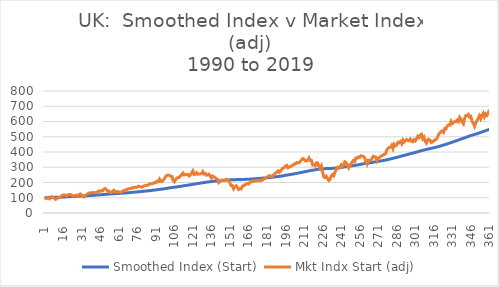
| Category | Smoothed Index (Start) | Mkt Indx Start (adj) |
|---|---|---|
| 1.0 | 100 | 100 |
| 2.0 | 100.297 | 97.055 |
| 3.0 | 100.58 | 95.78 |
| 4.0 | 100.884 | 98.164 |
| 5.0 | 101.138 | 93.34 |
| 6.0 | 101.524 | 106.637 |
| 7.0 | 101.912 | 107.137 |
| 8.0 | 102.267 | 104.192 |
| 9.0 | 102.533 | 95.473 |
| 10.0 | 102.735 | 89.209 |
| 11.0 | 102.991 | 94.771 |
| 12.0 | 103.301 | 100.327 |
| 13.0 | 103.619 | 101.316 |
| 14.0 | 103.944 | 102.266 |
| 15.0 | 104.385 | 114.104 |
| 16.0 | 104.858 | 117.647 |
| 17.0 | 105.333 | 118.018 |
| 18.0 | 105.793 | 116.926 |
| 19.0 | 106.203 | 112.277 |
| 20.0 | 106.685 | 119.671 |
| 21.0 | 107.186 | 121.955 |
| 22.0 | 107.675 | 121.093 |
| 23.0 | 108.126 | 117.558 |
| 24.0 | 108.504 | 110.575 |
| 25.0 | 108.899 | 112.63 |
| 26.0 | 109.331 | 116.484 |
| 27.0 | 109.761 | 116.563 |
| 28.0 | 110.134 | 111.262 |
| 29.0 | 110.618 | 122.5 |
| 30.0 | 111.12 | 124.711 |
| 31.0 | 111.527 | 115.494 |
| 32.0 | 111.863 | 108.753 |
| 33.0 | 112.16 | 104.99 |
| 34.0 | 112.57 | 116.471 |
| 35.0 | 113.026 | 121.468 |
| 36.0 | 113.534 | 126.877 |
| 37.0 | 114.084 | 131.413 |
| 38.0 | 114.624 | 130.829 |
| 39.0 | 115.185 | 133.259 |
| 40.0 | 115.757 | 134.761 |
| 41.0 | 116.302 | 132.468 |
| 42.0 | 116.855 | 133.616 |
| 43.0 | 117.428 | 135.931 |
| 44.0 | 118.007 | 137.035 |
| 45.0 | 118.664 | 145.15 |
| 46.0 | 119.284 | 141.879 |
| 47.0 | 119.95 | 146.847 |
| 48.0 | 120.595 | 145.328 |
| 49.0 | 121.347 | 156.404 |
| 50.0 | 122.142 | 161.209 |
| 51.0 | 122.857 | 153.718 |
| 52.0 | 123.461 | 143.152 |
| 53.0 | 124.077 | 144.632 |
| 54.0 | 124.611 | 136.977 |
| 55.0 | 125.109 | 133.729 |
| 56.0 | 125.681 | 141.46 |
| 57.0 | 126.323 | 148.82 |
| 58.0 | 126.855 | 138.222 |
| 59.0 | 127.407 | 140.576 |
| 60.0 | 127.946 | 139.737 |
| 61.0 | 128.478 | 139.328 |
| 62.0 | 128.968 | 135.456 |
| 63.0 | 129.462 | 136.255 |
| 64.0 | 130.01 | 141.979 |
| 65.0 | 130.592 | 145.788 |
| 66.0 | 131.222 | 150.878 |
| 67.0 | 131.839 | 150.026 |
| 68.0 | 132.523 | 157.206 |
| 69.0 | 133.218 | 158.754 |
| 70.0 | 133.924 | 160.223 |
| 71.0 | 134.622 | 159.972 |
| 72.0 | 135.363 | 164.764 |
| 73.0 | 136.113 | 166.17 |
| 74.0 | 136.892 | 169.492 |
| 75.0 | 137.66 | 169.003 |
| 76.0 | 138.431 | 169.783 |
| 77.0 | 139.263 | 176.376 |
| 78.0 | 140.059 | 173.418 |
| 79.0 | 140.822 | 170.591 |
| 80.0 | 141.561 | 168.668 |
| 81.0 | 142.372 | 176.495 |
| 82.0 | 143.205 | 179.071 |
| 83.0 | 144.038 | 179.754 |
| 84.0 | 144.888 | 182.006 |
| 85.0 | 145.756 | 184.385 |
| 86.0 | 146.681 | 190.557 |
| 87.0 | 147.612 | 191.923 |
| 88.0 | 148.534 | 191.561 |
| 89.0 | 149.482 | 194.817 |
| 90.0 | 150.481 | 200.517 |
| 91.0 | 151.456 | 198.807 |
| 92.0 | 152.515 | 207.951 |
| 93.0 | 153.55 | 206.11 |
| 94.0 | 154.734 | 221.791 |
| 95.0 | 155.755 | 206.334 |
| 96.0 | 156.759 | 205.275 |
| 97.0 | 157.862 | 215.799 |
| 98.0 | 159.061 | 226.157 |
| 99.0 | 160.374 | 238.413 |
| 100.0 | 161.766 | 247.251 |
| 101.0 | 163.148 | 247.031 |
| 102.0 | 164.522 | 247.245 |
| 103.0 | 165.827 | 241.308 |
| 104.0 | 167.106 | 239.562 |
| 105.0 | 168.118 | 213.703 |
| 106.0 | 169.037 | 205.129 |
| 107.0 | 170.088 | 218.861 |
| 108.0 | 171.234 | 229.16 |
| 109.0 | 172.408 | 232.687 |
| 110.0 | 173.586 | 233.824 |
| 111.0 | 174.862 | 244.53 |
| 112.0 | 176.195 | 251.062 |
| 113.0 | 177.63 | 262.133 |
| 114.0 | 178.928 | 249.382 |
| 115.0 | 180.261 | 253.754 |
| 116.0 | 181.559 | 251.166 |
| 117.0 | 182.861 | 252.461 |
| 118.0 | 184.053 | 242.351 |
| 119.0 | 185.299 | 248.501 |
| 120.0 | 186.688 | 263.624 |
| 121.0 | 188.193 | 276.238 |
| 122.0 | 189.453 | 252.694 |
| 123.0 | 190.714 | 253.673 |
| 124.0 | 192.071 | 264.11 |
| 125.0 | 193.324 | 254.615 |
| 126.0 | 194.579 | 255.642 |
| 127.0 | 195.832 | 256.307 |
| 128.0 | 197.1 | 258.663 |
| 129.0 | 198.486 | 271.348 |
| 130.0 | 199.709 | 255.883 |
| 131.0 | 200.961 | 259.669 |
| 132.0 | 202.09 | 248.199 |
| 133.0 | 203.243 | 251.413 |
| 134.0 | 204.425 | 254.974 |
| 135.0 | 205.464 | 241.547 |
| 136.0 | 206.37 | 229.005 |
| 137.0 | 207.407 | 242.629 |
| 138.0 | 208.39 | 237.925 |
| 139.0 | 209.296 | 230.945 |
| 140.0 | 210.142 | 225.492 |
| 141.0 | 210.928 | 220.102 |
| 142.0 | 211.501 | 199.289 |
| 143.0 | 212.135 | 205.851 |
| 144.0 | 212.856 | 214.886 |
| 145.0 | 213.581 | 215.836 |
| 146.0 | 214.279 | 213.565 |
| 147.0 | 214.954 | 211.843 |
| 148.0 | 215.715 | 220.749 |
| 149.0 | 216.435 | 217.276 |
| 150.0 | 217.124 | 214.603 |
| 151.0 | 217.627 | 196.551 |
| 152.0 | 217.948 | 178.577 |
| 153.0 | 218.275 | 179.472 |
| 154.0 | 218.392 | 158.631 |
| 155.0 | 218.636 | 171.486 |
| 156.0 | 218.943 | 177.936 |
| 157.0 | 219.157 | 168.73 |
| 158.0 | 219.22 | 153.939 |
| 159.0 | 219.329 | 158.478 |
| 160.0 | 219.432 | 157.954 |
| 161.0 | 219.687 | 173.257 |
| 162.0 | 220.02 | 181.211 |
| 163.0 | 220.359 | 182.061 |
| 164.0 | 220.771 | 189.532 |
| 165.0 | 221.212 | 192.725 |
| 166.0 | 221.621 | 189.853 |
| 167.0 | 222.124 | 199.488 |
| 168.0 | 222.65 | 202.226 |
| 169.0 | 223.234 | 208.276 |
| 170.0 | 223.797 | 206.583 |
| 171.0 | 224.416 | 212.605 |
| 172.0 | 225.004 | 209.866 |
| 173.0 | 225.632 | 214.291 |
| 174.0 | 226.228 | 211.538 |
| 175.0 | 226.852 | 214.747 |
| 176.0 | 227.44 | 211.512 |
| 177.0 | 228.06 | 215.111 |
| 178.0 | 228.736 | 221.181 |
| 179.0 | 229.435 | 223.937 |
| 180.0 | 230.184 | 229.354 |
| 181.0 | 230.994 | 236.035 |
| 182.0 | 231.83 | 239.136 |
| 183.0 | 232.722 | 245.296 |
| 184.0 | 233.586 | 243.081 |
| 185.0 | 234.389 | 237.542 |
| 186.0 | 235.279 | 246.801 |
| 187.0 | 236.246 | 255.115 |
| 188.0 | 237.292 | 263.641 |
| 189.0 | 238.36 | 266.561 |
| 190.0 | 239.51 | 275.502 |
| 191.0 | 240.571 | 267.352 |
| 192.0 | 241.711 | 276.017 |
| 193.0 | 242.951 | 286.694 |
| 194.0 | 244.263 | 294.797 |
| 195.0 | 245.599 | 298.068 |
| 196.0 | 247.036 | 309.072 |
| 197.0 | 248.493 | 312.022 |
| 198.0 | 249.788 | 296.799 |
| 199.0 | 251.131 | 302.508 |
| 200.0 | 252.502 | 306.231 |
| 201.0 | 253.884 | 308.143 |
| 202.0 | 255.302 | 312.725 |
| 203.0 | 256.802 | 321.913 |
| 204.0 | 258.279 | 320.67 |
| 205.0 | 259.851 | 331.041 |
| 206.0 | 261.4 | 329.864 |
| 207.0 | 262.93 | 328.986 |
| 208.0 | 264.556 | 339.665 |
| 209.0 | 266.251 | 347.63 |
| 210.0 | 268.029 | 357.052 |
| 211.0 | 269.764 | 353.95 |
| 212.0 | 271.366 | 341.815 |
| 213.0 | 272.944 | 340.58 |
| 214.0 | 274.574 | 346.725 |
| 215.0 | 276.34 | 361.47 |
| 216.0 | 277.919 | 343.962 |
| 217.0 | 279.493 | 344.575 |
| 218.0 | 280.756 | 314.466 |
| 219.0 | 282.033 | 316.743 |
| 220.0 | 283.235 | 310.098 |
| 221.0 | 284.622 | 329.383 |
| 222.0 | 285.991 | 328.547 |
| 223.0 | 287.118 | 305.177 |
| 224.0 | 288.126 | 294.118 |
| 225.0 | 289.273 | 308.785 |
| 226.0 | 290.004 | 267.841 |
| 227.0 | 290.412 | 236.052 |
| 228.0 | 290.78 | 232.32 |
| 229.0 | 291.233 | 241.087 |
| 230.0 | 291.544 | 227.215 |
| 231.0 | 291.708 | 212.63 |
| 232.0 | 291.943 | 219.913 |
| 233.0 | 292.398 | 242.082 |
| 234.0 | 292.953 | 252.425 |
| 235.0 | 293.426 | 244.478 |
| 236.0 | 294.105 | 265.463 |
| 237.0 | 294.985 | 286.019 |
| 238.0 | 295.994 | 299.56 |
| 239.0 | 296.942 | 294.094 |
| 240.0 | 297.971 | 302.808 |
| 241.0 | 299.124 | 315.937 |
| 242.0 | 300.156 | 304.593 |
| 243.0 | 301.284 | 314.851 |
| 244.0 | 302.616 | 336.08 |
| 245.0 | 303.891 | 331.3 |
| 246.0 | 304.951 | 310.591 |
| 247.0 | 305.86 | 296.209 |
| 248.0 | 306.967 | 316.665 |
| 249.0 | 308.06 | 315.923 |
| 250.0 | 309.351 | 336.56 |
| 251.0 | 310.718 | 345.001 |
| 252.0 | 311.997 | 337.115 |
| 253.0 | 313.508 | 361.108 |
| 254.0 | 314.988 | 359.062 |
| 255.0 | 316.542 | 367.542 |
| 256.0 | 318.055 | 364.418 |
| 257.0 | 319.67 | 375.622 |
| 258.0 | 321.245 | 372.779 |
| 259.0 | 322.792 | 370.962 |
| 260.0 | 324.245 | 362.667 |
| 261.0 | 325.438 | 337.598 |
| 262.0 | 326.454 | 320.666 |
| 263.0 | 327.715 | 345.986 |
| 264.0 | 328.955 | 344.65 |
| 265.0 | 330.216 | 347.507 |
| 266.0 | 331.561 | 356.899 |
| 267.0 | 333.05 | 372.145 |
| 268.0 | 334.493 | 368.522 |
| 269.0 | 335.913 | 367.236 |
| 270.0 | 337.074 | 342.21 |
| 271.0 | 338.391 | 358.69 |
| 272.0 | 339.747 | 363.418 |
| 273.0 | 341.173 | 371.405 |
| 274.0 | 342.63 | 375.374 |
| 275.0 | 344.115 | 379.19 |
| 276.0 | 345.656 | 385.77 |
| 277.0 | 347.223 | 389.502 |
| 278.0 | 349.028 | 414.233 |
| 279.0 | 350.913 | 423.544 |
| 280.0 | 352.844 | 429.357 |
| 281.0 | 354.786 | 431.704 |
| 282.0 | 356.838 | 444.133 |
| 283.0 | 358.654 | 421.826 |
| 284.0 | 360.742 | 450.321 |
| 285.0 | 362.715 | 440.209 |
| 286.0 | 364.723 | 444.991 |
| 287.0 | 366.907 | 463.927 |
| 288.0 | 369.042 | 460.527 |
| 289.0 | 371.245 | 468.839 |
| 290.0 | 373.289 | 454.363 |
| 291.0 | 375.556 | 478.052 |
| 292.0 | 377.682 | 465.454 |
| 293.0 | 379.893 | 475.387 |
| 294.0 | 382.153 | 481.751 |
| 295.0 | 384.335 | 475.466 |
| 296.0 | 386.486 | 473.923 |
| 297.0 | 388.724 | 484.007 |
| 298.0 | 390.812 | 470.484 |
| 299.0 | 392.852 | 467.156 |
| 300.0 | 395.014 | 480.696 |
| 301.0 | 397.083 | 472.902 |
| 302.0 | 399.262 | 485.22 |
| 303.0 | 401.605 | 503.182 |
| 304.0 | 403.848 | 494.668 |
| 305.0 | 406.225 | 509.562 |
| 306.0 | 408.653 | 516.342 |
| 307.0 | 410.767 | 486.572 |
| 308.0 | 412.983 | 498.155 |
| 309.0 | 414.918 | 471.556 |
| 310.0 | 416.71 | 458.616 |
| 311.0 | 418.706 | 480.095 |
| 312.0 | 420.714 | 482.763 |
| 313.0 | 422.647 | 476.582 |
| 314.0 | 424.42 | 461.854 |
| 315.0 | 426.218 | 465.523 |
| 316.0 | 428.093 | 474.51 |
| 317.0 | 430.009 | 479.87 |
| 318.0 | 431.946 | 483.129 |
| 319.0 | 434.004 | 496.707 |
| 320.0 | 436.248 | 516.578 |
| 321.0 | 438.574 | 526.306 |
| 322.0 | 440.973 | 535.18 |
| 323.0 | 443.385 | 538.137 |
| 324.0 | 445.693 | 529.336 |
| 325.0 | 448.25 | 555.807 |
| 326.0 | 450.771 | 553.884 |
| 327.0 | 453.446 | 571.028 |
| 328.0 | 456.173 | 577.969 |
| 329.0 | 458.859 | 575.774 |
| 330.0 | 461.778 | 600.837 |
| 331.0 | 464.528 | 585.958 |
| 332.0 | 467.328 | 592.742 |
| 333.0 | 470.191 | 600.927 |
| 334.0 | 473.008 | 598.313 |
| 335.0 | 475.918 | 609.412 |
| 336.0 | 478.706 | 599.273 |
| 337.0 | 481.761 | 627.841 |
| 338.0 | 484.674 | 615.641 |
| 339.0 | 487.365 | 595.451 |
| 340.0 | 489.929 | 584.55 |
| 341.0 | 492.852 | 622.092 |
| 342.0 | 495.927 | 639.419 |
| 343.0 | 498.97 | 638.223 |
| 344.0 | 502.075 | 646.423 |
| 345.0 | 504.98 | 628.54 |
| 346.0 | 507.909 | 632.915 |
| 347.0 | 510.49 | 600.025 |
| 348.0 | 512.954 | 590.14 |
| 349.0 | 515.18 | 568.003 |
| 350.0 | 517.629 | 591.725 |
| 351.0 | 520.196 | 605.285 |
| 352.0 | 522.908 | 621.407 |
| 353.0 | 525.768 | 638.08 |
| 354.0 | 528.417 | 618.906 |
| 355.0 | 531.276 | 641.62 |
| 356.0 | 534.243 | 654.455 |
| 357.0 | 536.957 | 631.113 |
| 358.0 | 539.839 | 649.756 |
| 359.0 | 542.611 | 640.653 |
| 360.0 | 545.508 | 655.006 |
| 361.0 | 548.603 | 676.769 |